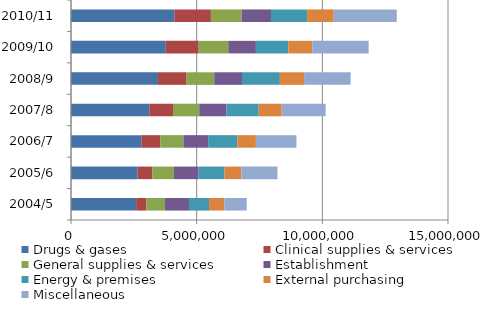
| Category | Drugs & gases | Clinical supplies & services | General supplies & services | Establishment | Energy & premises | External purchasing | Miscellaneous |
|---|---|---|---|---|---|---|---|
| 2004/5 | 2591885 | 405985 | 743426 | 951971 | 799962 | 609215 | 888577 |
| 2005/6 | 2647598 | 594689 | 853397 | 981559 | 1031786 | 669508 | 1435572 |
| 2006/7 | 2814027 | 748493 | 911504 | 982216 | 1161463 | 738923 | 1612571 |
| 2007/8 | 3115381 | 942142 | 1045835 | 1085634 | 1279173 | 916352 | 1747727 |
| 2008/9 | 3460008 | 1119410 | 1119750 | 1104583 | 1506901 | 962768 | 1852820 |
| 2009/10 | 3773131 | 1307254 | 1177681 | 1099538 | 1289767 | 950531 | 2243732 |
| 2010/11 | 4111128 | 1455860 | 1226148 | 1163635 | 1436318 | 1061324 | 2506806 |